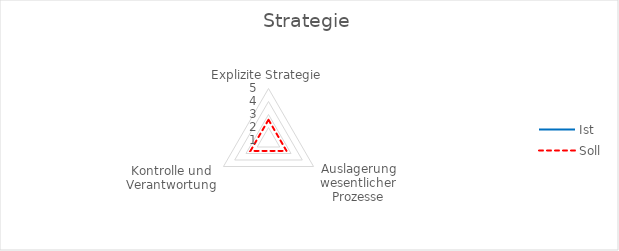
| Category | Ist | Soll |
|---|---|---|
| Explizite Strategie | 1 | 2.6 |
| Auslagerung wesentlicher Prozesse | 1 | 2.6 |
| Kontrolle und Verantwortung | 1 | 2.6 |